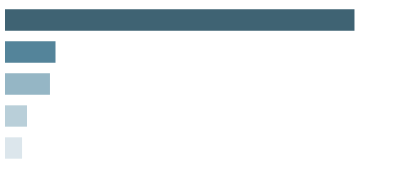
| Category | Series 0 |
|---|---|
| 0 | 40500 |
| 1 | 53000 |
| 2 | 111000 |
| 3 | 125000 |
| 4 | 880000 |